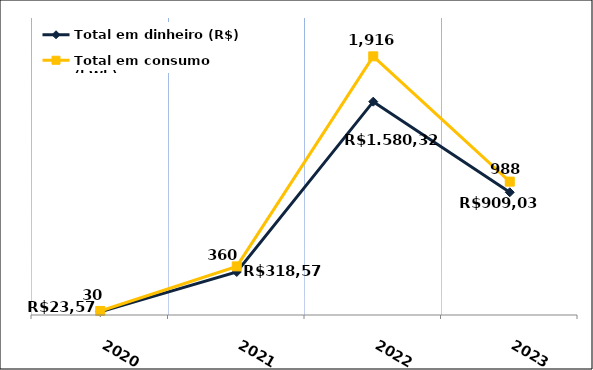
| Category | Total em dinheiro (R$) |
|---|---|
| 2020.0 | 23.57 |
| 2021.0 | 318.57 |
| 2022.0 | 1580.32 |
| 2023.0 | 909.03 |